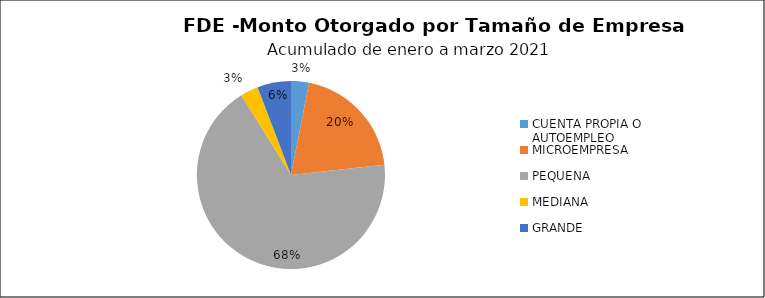
| Category | Monto | Créditos |
|---|---|---|
| CUENTA PROPIA O AUTOEMPLEO | 0.16 | 8 |
| MICROEMPRESA | 1.048 | 41 |
| PEQUENA | 3.522 | 39 |
| MEDIANA | 0.16 | 1 |
| GRANDE | 0.3 | 1 |